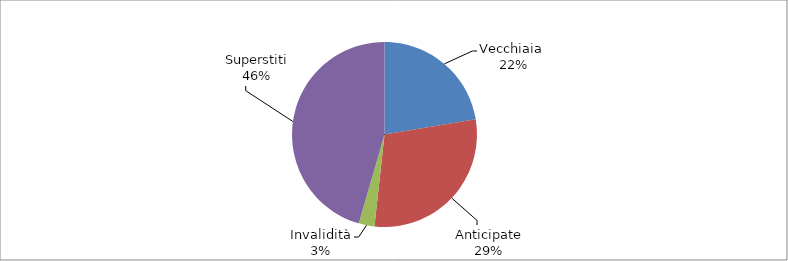
| Category | Series 0 |
|---|---|
| Vecchiaia  | 7043 |
| Anticipate | 9242 |
| Invalidità | 864 |
| Superstiti | 14328 |